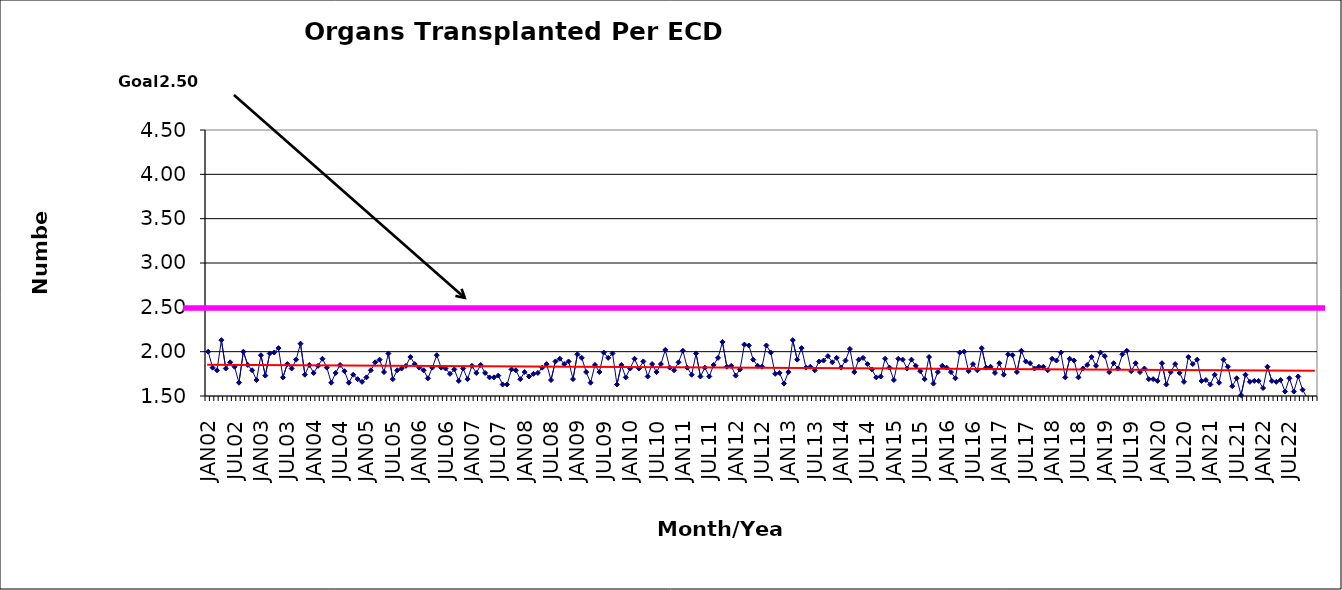
| Category | Series 0 |
|---|---|
| JAN02 | 2 |
| FEB02 | 1.82 |
| MAR02 | 1.79 |
| APR02 | 2.13 |
| MAY02 | 1.81 |
| JUN02 | 1.88 |
| JUL02 | 1.83 |
| AUG02 | 1.65 |
| SEP02 | 2 |
| OCT02 | 1.85 |
| NOV02 | 1.79 |
| DEC02 | 1.68 |
| JAN03 | 1.96 |
| FEB03 | 1.73 |
| MAR03 | 1.98 |
| APR03 | 1.99 |
| MAY03 | 2.04 |
| JUN03 | 1.71 |
| JUL03 | 1.86 |
| AUG03 | 1.81 |
| SEP03 | 1.91 |
| OCT03 | 2.09 |
| NOV03 | 1.74 |
| DEC03 | 1.85 |
| JAN04 | 1.76 |
| FEB04 | 1.84 |
| MAR04 | 1.92 |
| APR04 | 1.82 |
| MAY04 | 1.65 |
| JUN04 | 1.76 |
| JUL04 | 1.85 |
| AUG04 | 1.78 |
| SEP04 | 1.65 |
| OCT04 | 1.74 |
| NOV04 | 1.69 |
| DEC04 | 1.66 |
| JAN05 | 1.71 |
| FEB05 | 1.79 |
| MAR05 | 1.88 |
| APR05 | 1.91 |
| MAY05 | 1.77 |
| JUN05 | 1.98 |
| JUL05 | 1.69 |
| AUG05 | 1.79 |
| SEP05 | 1.81 |
| OCT05 | 1.84 |
| NOV05 | 1.94 |
| DEC05 | 1.86 |
| JAN06 | 1.82 |
| FEB06 | 1.79 |
| MAR06 | 1.7 |
| APR06 | 1.82 |
| MAY06 | 1.96 |
| JUN06 | 1.82 |
| JUL06 | 1.81 |
| AUG06 | 1.75 |
| SEP06 | 1.8 |
| OCT06 | 1.67 |
| NOV06 | 1.81 |
| DEC06 | 1.69 |
| JAN07 | 1.84 |
| FEB07 | 1.76 |
| MAR07 | 1.85 |
| APR07 | 1.76 |
| MAY07 | 1.71 |
| JUN07 | 1.71 |
| JUL07 | 1.73 |
| AUG07 | 1.63 |
| SEP07 | 1.63 |
| OCT07 | 1.8 |
| NOV07 | 1.79 |
| DEC07 | 1.69 |
| JAN08 | 1.77 |
| FEB08 | 1.72 |
| MAR08 | 1.75 |
| APR08 | 1.76 |
| MAY08 | 1.82 |
| JUN08 | 1.86 |
| JUL08 | 1.68 |
| AUG08 | 1.89 |
| SEP08 | 1.92 |
| OCT08 | 1.86 |
| NOV08 | 1.89 |
| DEC08 | 1.69 |
| JAN09 | 1.97 |
| FEB09 | 1.93 |
| MAR09 | 1.77 |
| APR09 | 1.65 |
| MAY09 | 1.85 |
| JUN09 | 1.77 |
| JUL09 | 1.99 |
| AUG09 | 1.93 |
| SEP09 | 1.98 |
| OCT09 | 1.63 |
| NOV09 | 1.85 |
| DEC09 | 1.71 |
| JAN10 | 1.81 |
| FEB10 | 1.92 |
| MAR10 | 1.81 |
| APR10 | 1.89 |
| MAY10 | 1.72 |
| JUN10 | 1.86 |
| JUL10 | 1.77 |
| AUG10 | 1.86 |
| SEP10 | 2.02 |
| OCT10 | 1.82 |
| NOV10 | 1.79 |
| DEC10 | 1.88 |
| JAN11 | 2.01 |
| FEB11 | 1.82 |
| MAR11 | 1.74 |
| APR11 | 1.98 |
| MAY11 | 1.72 |
| JUN11 | 1.82 |
| JUL11 | 1.72 |
| AUG11 | 1.85 |
| SEP11 | 1.93 |
| OCT11 | 2.11 |
| NOV11 | 1.83 |
| DEC11 | 1.84 |
| JAN12 | 1.73 |
| FEB12 | 1.8 |
| MAR12 | 2.08 |
| APR12 | 2.07 |
| MAY12 | 1.91 |
| JUN12 | 1.84 |
| JUL12 | 1.83 |
| AUG12 | 2.07 |
| SEP12 | 1.99 |
| OCT12 | 1.75 |
| NOV12 | 1.76 |
| DEC12 | 1.64 |
| JAN13 | 1.77 |
| FEB13 | 2.13 |
| MAR13 | 1.91 |
| APR13 | 2.04 |
| MAY13 | 1.82 |
| JUN13 | 1.83 |
| JUL13 | 1.79 |
| AUG13 | 1.89 |
| SEP13 | 1.9 |
| OCT13 | 1.95 |
| NOV13 | 1.88 |
| DEC13 | 1.93 |
| JAN14 | 1.82 |
| FEB14 | 1.9 |
| MAR14 | 2.03 |
| APR14 | 1.77 |
| MAY14 | 1.91 |
| JUN14 | 1.93 |
| JUL14 | 1.86 |
| AUG14 | 1.8 |
| SEP14 | 1.71 |
| OCT14 | 1.72 |
| NOV14 | 1.92 |
| DEC14 | 1.82 |
| JAN15 | 1.68 |
| FEB15 | 1.92 |
| MAR15 | 1.91 |
| APR15 | 1.81 |
| MAY15 | 1.91 |
| JUN15 | 1.84 |
| JUL15 | 1.78 |
| AUG15 | 1.69 |
| SEP15 | 1.94 |
| OCT15 | 1.64 |
| NOV15 | 1.77 |
| DEC15 | 1.84 |
| JAN16 | 1.82 |
| FEB16 | 1.77 |
| MAR16 | 1.7 |
| APR16 | 1.99 |
| MAY16 | 2 |
| JUN16 | 1.78 |
| JUL16 | 1.86 |
| AUG16 | 1.79 |
| SEP16 | 2.04 |
| OCT16 | 1.82 |
| NOV16 | 1.83 |
| DEC16 | 1.76 |
| JAN17 | 1.87 |
| FEB17 | 1.74 |
| MAR17 | 1.97 |
| APR17 | 1.96 |
| MAY17 | 1.77 |
| JUN17 | 2.01 |
| JUL17 | 1.89 |
| AUG17 | 1.87 |
| SEP17 | 1.81 |
| OCT17 | 1.83 |
| NOV17 | 1.83 |
| DEC17 | 1.79 |
| JAN18 | 1.92 |
| FEB18 | 1.9 |
| MAR18 | 1.99 |
| APR18 | 1.71 |
| MAY18 | 1.92 |
| JUN18 | 1.9 |
| JUL18 | 1.71 |
| AUG18 | 1.81 |
| SEP18 | 1.85 |
| OCT18 | 1.94 |
| NOV18 | 1.84 |
| DEC18 | 1.99 |
| JAN19 | 1.95 |
| FEB19 | 1.77 |
| MAR19 | 1.87 |
| APR19 | 1.81 |
| MAY19 | 1.97 |
| JUN19 | 2.01 |
| JUL19 | 1.78 |
| AUG19 | 1.87 |
| SEP19 | 1.77 |
| OCT19 | 1.81 |
| NOV19 | 1.69 |
| DEC19 | 1.69 |
| JAN20 | 1.67 |
| FEB20 | 1.87 |
| MAR20 | 1.63 |
| APR20 | 1.77 |
| MAY20 | 1.86 |
| JUN20 | 1.76 |
| JUL20 | 1.66 |
| AUG20 | 1.94 |
| SEP20 | 1.86 |
| OCT20 | 1.91 |
| NOV20 | 1.67 |
| DEC20 | 1.68 |
| JAN21 | 1.63 |
| FEB21 | 1.74 |
| MAR21 | 1.65 |
| APR21 | 1.91 |
| MAY21 | 1.83 |
| JUN21 | 1.61 |
| JUL21 | 1.7 |
| AUG21 | 1.51 |
| SEP21 | 1.74 |
| OCT21 | 1.66 |
| NOV21 | 1.67 |
| DEC21 | 1.67 |
| JAN22 | 1.59 |
| FEB22 | 1.83 |
| MAR22 | 1.67 |
| APR22 | 1.66 |
| MAY22 | 1.68 |
| JUN22 | 1.55 |
| JUL22 | 1.7 |
| AUG22 | 1.55 |
| SEP22 | 1.72 |
| OCT22 | 1.57 |
| NOV22 | 1.48 |